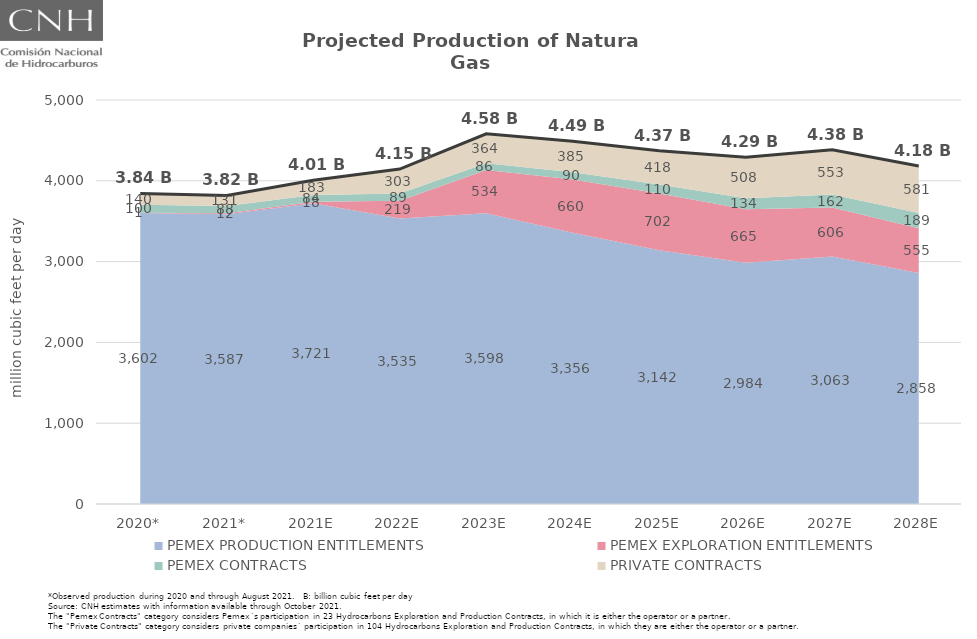
| Category | Total |
|---|---|
| 2020* | 3843.295 |
| 2021* | 3818.201 |
| 2021E | 4006.789 |
| 2022E | 4145.848 |
| 2023E | 4582.457 |
| 2024E | 4490.62 |
| 2025E | 4371.126 |
| 2026E | 4290.661 |
| 2027E | 4383.863 |
| 2028E | 4182.519 |